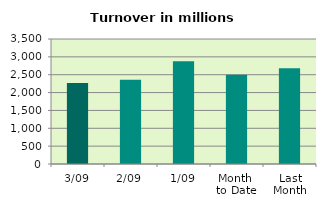
| Category | Series 0 |
|---|---|
| 3/09 | 2265.634 |
| 2/09 | 2359.817 |
| 1/09 | 2873.709 |
| Month 
to Date | 2499.72 |
| Last
Month | 2681.097 |